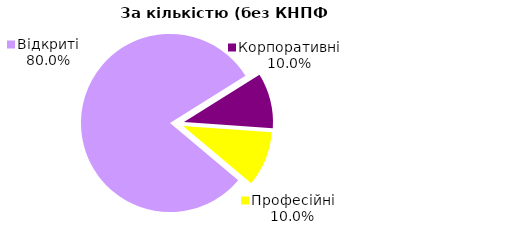
| Category | Series 0 |
|---|---|
| Відкриті | 48 |
| Корпоративні | 6 |
| Професійні | 6 |